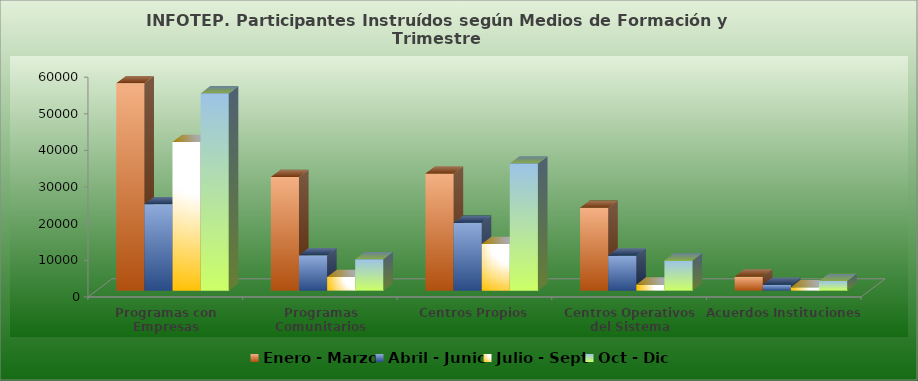
| Category | Enero - Marzo | Abril - Junio | Julio - Sept | Oct - Dic |
|---|---|---|---|---|
| Programas con Empresas | 56626 | 23566 | 40540 | 53840 |
| Programas Comunitarios | 30999 | 9619 | 3723 | 8581 |
| Centros Propios | 31945 | 18502 | 12748 | 34717 |
| Centros Operativos del Sistema | 22599 | 9571 | 1641 | 8204 |
| Acuerdos Instituciones | 3832 | 1603 | 904 | 2628 |